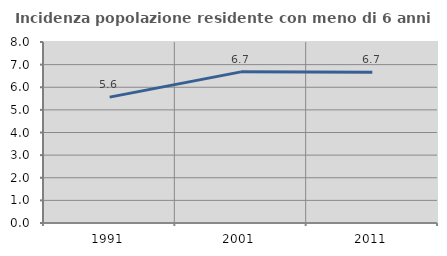
| Category | Incidenza popolazione residente con meno di 6 anni |
|---|---|
| 1991.0 | 5.563 |
| 2001.0 | 6.68 |
| 2011.0 | 6.662 |